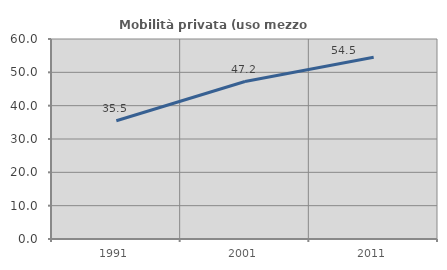
| Category | Mobilità privata (uso mezzo privato) |
|---|---|
| 1991.0 | 35.475 |
| 2001.0 | 47.239 |
| 2011.0 | 54.519 |